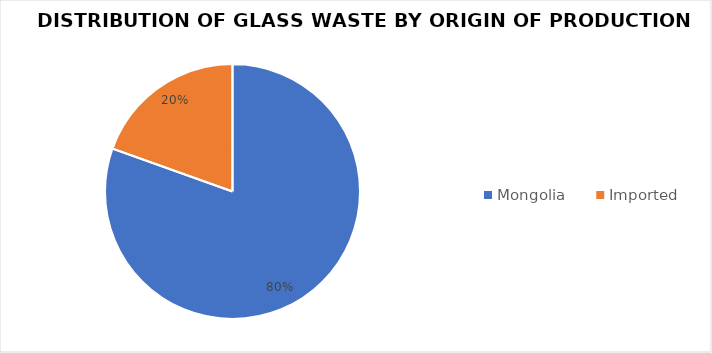
| Category | Series 0 |
|---|---|
| Mongolia | 1262.9 |
| Imported | 306.729 |